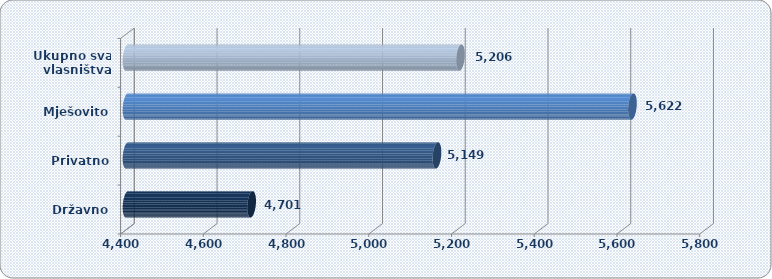
| Category | Prosječna mjesečna neto plaća po zaposlenom |
|---|---|
| Državno | 4701.23 |
| Privatno | 5149.33 |
| Mješovito | 5621.823 |
| Ukupno sva
 vlasništva | 5206.115 |